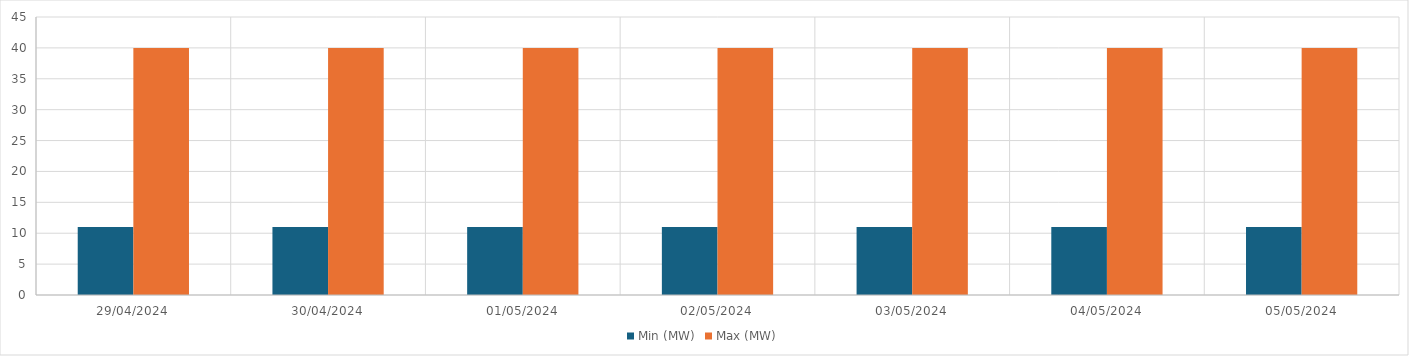
| Category | Min (MW) | Max (MW) |
|---|---|---|
| 29/04/2024 | 11 | 40 |
| 30/04/2024 | 11 | 40 |
| 01/05/2024 | 11 | 40 |
| 02/05/2024 | 11 | 40 |
| 03/05/2024 | 11 | 40 |
| 04/05/2024 | 11 | 40 |
| 05/05/2024 | 11 | 40 |